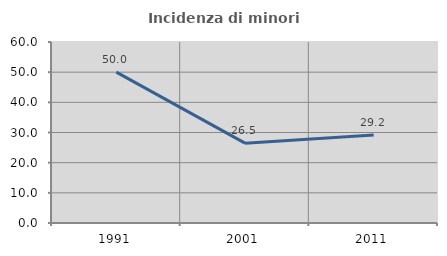
| Category | Incidenza di minori stranieri |
|---|---|
| 1991.0 | 50 |
| 2001.0 | 26.471 |
| 2011.0 | 29.167 |